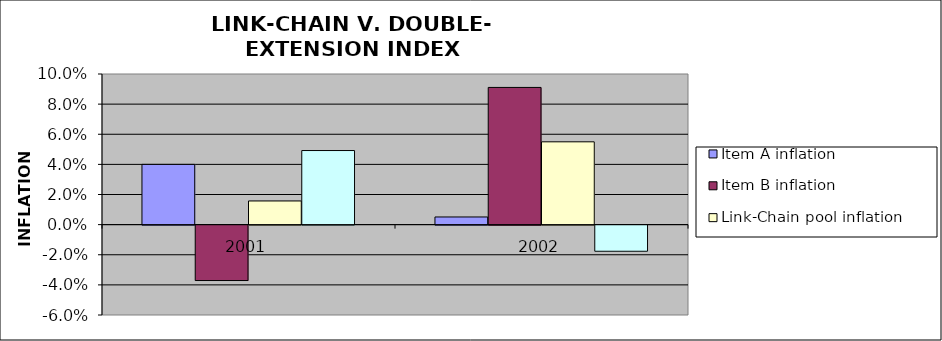
| Category | Item A inflation | Item B inflation | Link-Chain pool inflation | Double Extension pool inflation |
|---|---|---|---|---|
| 2001.0 | 0.04 | -0.037 | 0.016 | 0.049 |
| 2002.0 | 0.005 | 0.091 | 0.055 | -0.017 |